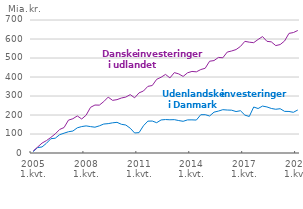
| Category | Udenlandske investeringer i Danmark | Danske investeringer i udlandet |
|---|---|---|
| 2005 1.kvt. | 7.1 | 10.9 |
| 2005 2.kvt. | 28.5 | 31.4 |
| 2005 3.kvt. | 31.8 | 52.1 |
| 2005 4.kvt. | 51 | 65.2 |
| 2006 1.kvt. | 75.1 | 82 |
| 2006 2.kvt. | 77.9 | 100.6 |
| 2006 3.kvt. | 96.3 | 123.9 |
| 2006 4.kvt. | 104.3 | 134.1 |
| 2007 1.kvt. | 111.9 | 173 |
| 2007 2.kvt. | 115.7 | 180.4 |
| 2007 3.kvt. | 132.6 | 195.1 |
| 2007 4.kvt. | 139.1 | 179.1 |
| 2008 1.kvt. | 142.6 | 198.9 |
| 2008 2.kvt. | 138.9 | 240.3 |
| 2008 3.kvt. | 135.8 | 252.4 |
| 2008 4.kvt. | 142.9 | 251.9 |
| 2009 1.kvt. | 152.4 | 270.5 |
| 2009 2.kvt. | 154.6 | 294.1 |
| 2009 3.kvt. | 158.8 | 277 |
| 2009 4.kvt. | 161.4 | 280.8 |
| 2010 1.kvt. | 151.1 | 289.4 |
| 2010 2.kvt. | 147.2 | 294.4 |
| 2010 3.kvt. | 130.5 | 307.2 |
| 2010 4.kvt. | 105.4 | 290.5 |
| 2011 1.kvt. | 107.2 | 316.6 |
| 2011 2.kvt. | 143.3 | 326.3 |
| 2011 3.kvt. | 167.7 | 350.7 |
| 2011 4.kvt. | 168.2 | 355.2 |
| 2012 1.kvt. | 159.5 | 387.8 |
| 2012 2.kvt. | 174 | 398.7 |
| 2012 3.kvt. | 176.1 | 413.6 |
| 2012 4.kvt. | 174.9 | 395.2 |
| 2013 1.kvt. | 175.5 | 423.1 |
| 2013 2.kvt. | 170.8 | 416.3 |
| 2013 3.kvt. | 166.8 | 403.1 |
| 2013 4.kvt. | 174.2 | 422.1 |
| 2014 1.kvt. | 174.4 | 429.3 |
| 2014 2.kvt. | 173.4 | 427.2 |
| 2014 3.kvt. | 201.5 | 439.2 |
| 2014 4.kvt. | 201.7 | 446 |
| 2015 1.kvt. | 194.9 | 483 |
| 2015 2.kvt. | 214.9 | 486.5 |
| 2015 3.kvt. | 220.6 | 502.9 |
| 2015 4.kvt. | 228 | 501.2 |
| 2016 1.kvt. | 226.2 | 531.2 |
| 2016 2.kvt. | 225.3 | 537 |
| 2016 3.kvt. | 218.1 | 544.4 |
| 2016 4.kvt. | 222.5 | 561 |
| 2017 1.kvt. | 199.3 | 587.7 |
| 2017 2.kvt. | 192.3 | 583.3 |
| 2017 3.kvt. | 242 | 580.7 |
| 2017 4.kvt. | 234.1 | 597.6 |
| 2018 1.kvt. | 247 | 612.8 |
| 2018 2.kvt. | 242.5 | 587.8 |
| 2018 3.kvt. | 234.4 | 584.8 |
| 2018 4.kvt. | 230.1 | 565.3 |
| 2019 1.kvt. | 233.1 | 570.7 |
| 2019 2.kvt. | 219.1 | 589.6 |
| 2019 3.kvt. | 218.6 | 629.6 |
| 2019 4.kvt. | 214.2 | 633.9 |
| 2020 1.kvt. | 226.5 | 644.9 |